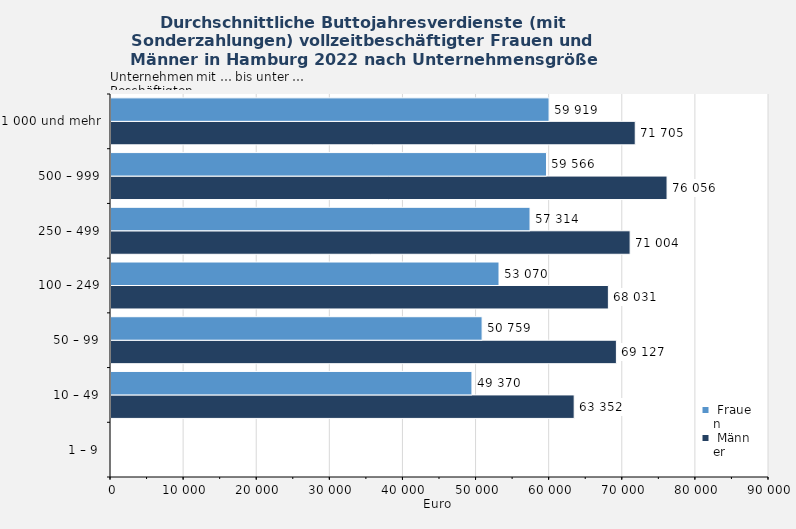
| Category |  Männer |  Frauen |
|---|---|---|
| 1 – 9 | 0 | 0 |
| 10 – 49 | 63352 | 49370 |
| 50 – 99 | 69127 | 50759 |
| 100 – 249 | 68031 | 53070 |
| 250 – 499 | 71004 | 57314 |
| 500 – 999 | 76056 | 59566 |
| 1 000 und mehr | 71705 | 59919 |